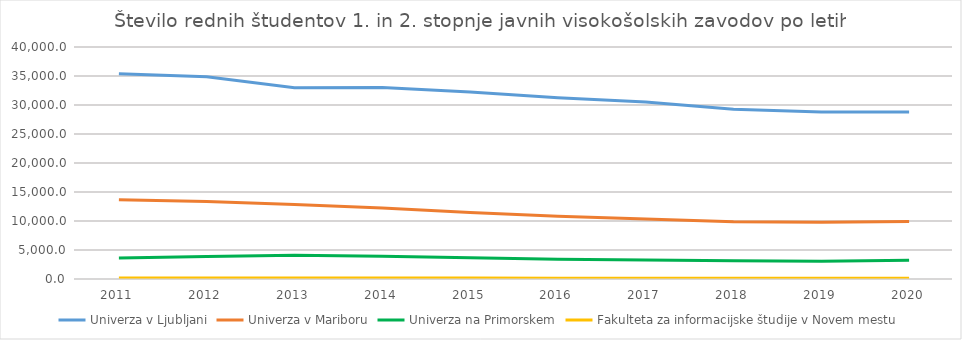
| Category | Univerza v Ljubljani | Univerza v Mariboru | Univerza na Primorskem | Fakulteta za informacijske študije v Novem mestu |
|---|---|---|---|---|
| 2011.0 | 35395 | 13676 | 3609 | 173 |
| 2012.0 | 34887.5 | 13373.5 | 3900 | 176 |
| 2013.0 | 32990 | 12841.5 | 4088 | 183 |
| 2014.0 | 33010.5 | 12256 | 3912 | 170 |
| 2015.0 | 32255.5 | 11470.5 | 3658 | 152 |
| 2016.0 | 31232.5 | 10823.5 | 3410 | 134 |
| 2017.0 | 30500 | 10358 | 3283 | 133 |
| 2018.0 | 29261 | 9879 | 3149 | 109 |
| 2019.0 | 28794 | 9787 | 3080 | 118 |
| 2020.0 | 28809 | 9929 | 3213 | 113 |